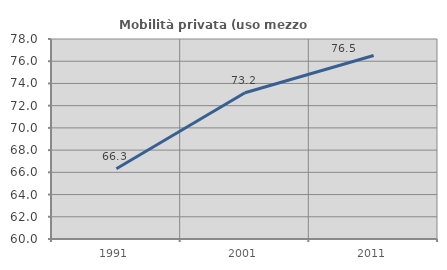
| Category | Mobilità privata (uso mezzo privato) |
|---|---|
| 1991.0 | 66.324 |
| 2001.0 | 73.167 |
| 2011.0 | 76.518 |